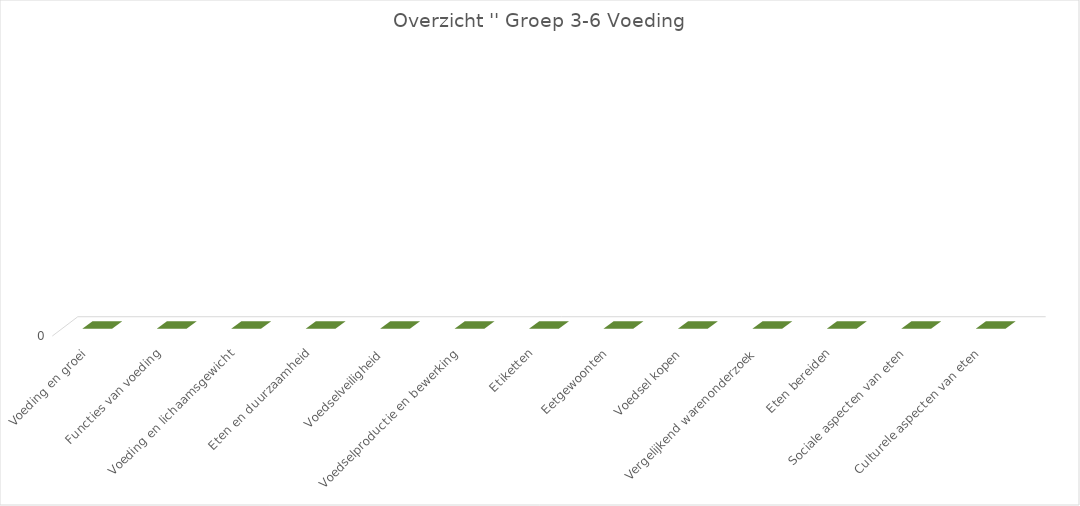
| Category | Series 3 |
|---|---|
| Voeding en groei | 0 |
| Functies van voeding | 0 |
| Voeding en lichaamsgewicht | 0 |
| Eten en duurzaamheid | 0 |
| Voedselveiligheid | 0 |
| Voedselproductie en bewerking | 0 |
| Etiketten | 0 |
| Eetgewoonten | 0 |
| Voedsel kopen | 0 |
| Vergelijkend warenonderzoek | 0 |
| Eten bereiden | 0 |
| Sociale aspecten van eten | 0 |
| Culturele aspecten van eten | 0 |